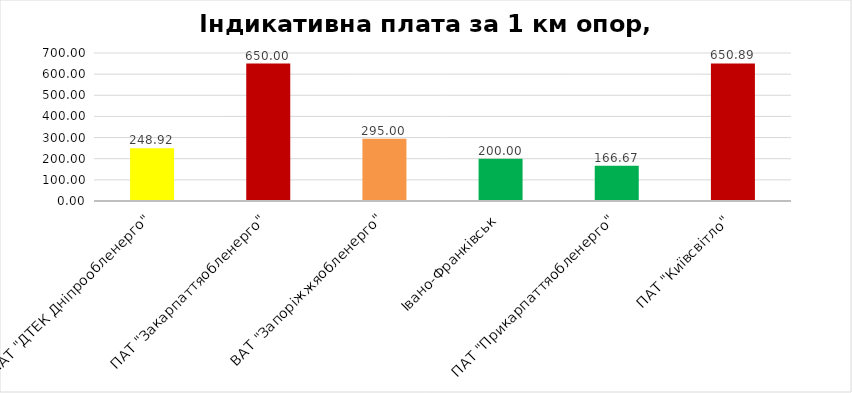
| Category | Series 0 |
|---|---|
| ПАТ "ДТЕК Дніпрообленерго" | 248.92 |
| ПАТ "Закарпаттяобленерго" | 650 |
| ВАТ "Запоріжжяобленерго" | 295 |
| Івано-Франківськ | 200 |
| ПАТ "Прикарпаттяобленерго" | 166.67 |
| ПАТ "Київсвітло" | 650.89 |